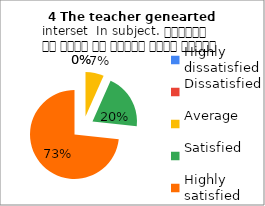
| Category | 4 The teacher genearted
interset  In subject. शिक्षक ने विषय के प्रति रुचि जागृत की |
|---|---|
| Highly dissatisfied | 0 |
| Dissatisfied | 0 |
| Average | 1 |
| Satisfied | 3 |
| Highly satisfied | 11 |